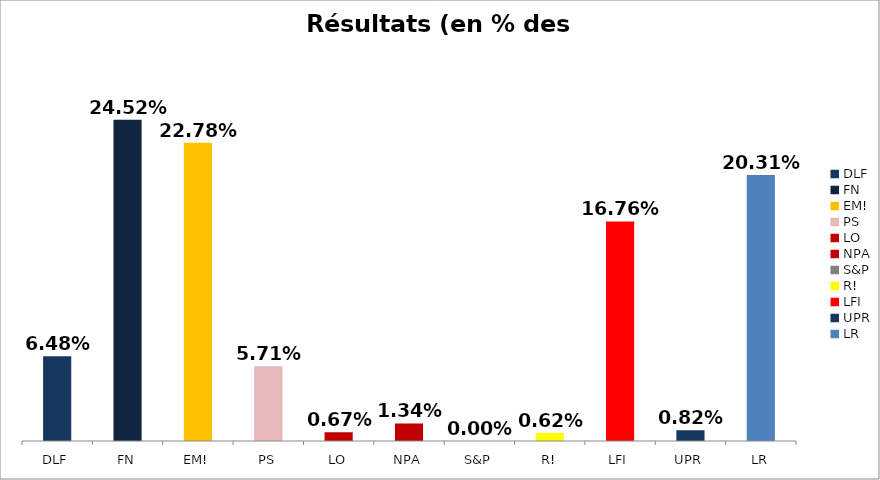
| Category | Résultats |
|---|---|
| DLF | 0.065 |
| FN | 0.245 |
| EM! | 0.228 |
| PS | 0.057 |
| LO | 0.007 |
| NPA | 0.013 |
| S&P | 0 |
| R! | 0.006 |
| LFI | 0.168 |
| UPR | 0.008 |
| LR | 0.203 |